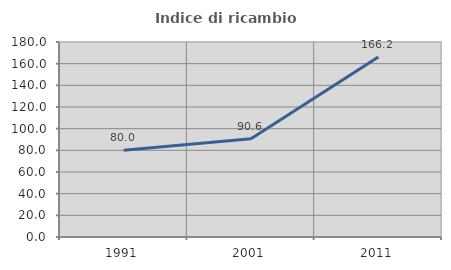
| Category | Indice di ricambio occupazionale  |
|---|---|
| 1991.0 | 80 |
| 2001.0 | 90.625 |
| 2011.0 | 166.154 |